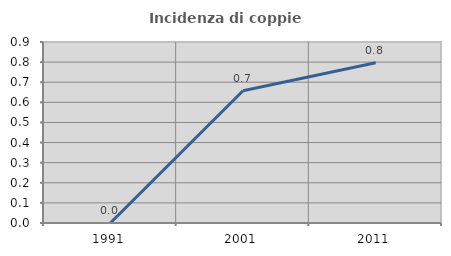
| Category | Incidenza di coppie miste |
|---|---|
| 1991.0 | 0 |
| 2001.0 | 0.658 |
| 2011.0 | 0.797 |